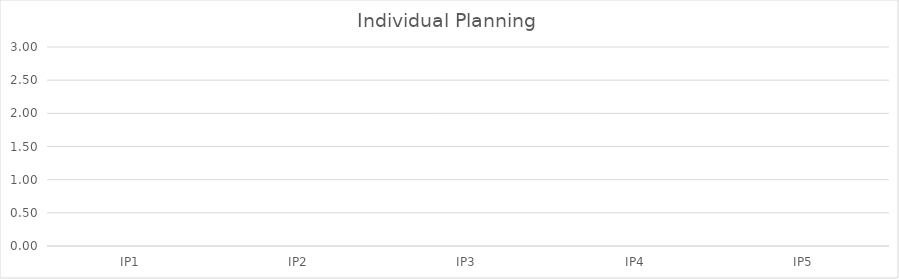
| Category | Series 0 |
|---|---|
| IP1 | 0 |
| IP2 | 0 |
| IP3 | 0 |
| IP4 | 0 |
| IP5 | 0 |